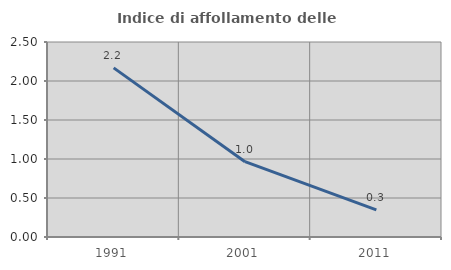
| Category | Indice di affollamento delle abitazioni  |
|---|---|
| 1991.0 | 2.168 |
| 2001.0 | 0.965 |
| 2011.0 | 0.348 |